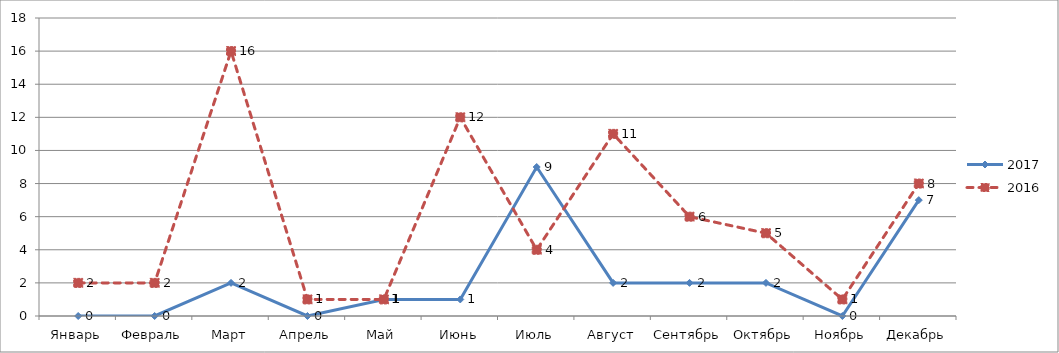
| Category | 2017 | 2016 |
|---|---|---|
| Январь | 0 | 2 |
| Февраль | 0 | 2 |
| Март | 2 | 16 |
| Апрель | 0 | 1 |
| Май | 1 | 1 |
| Июнь | 1 | 12 |
| Июль | 9 | 4 |
| Август | 2 | 11 |
| Сентябрь | 2 | 6 |
| Октябрь | 2 | 5 |
| Ноябрь | 0 | 1 |
| Декабрь | 7 | 8 |